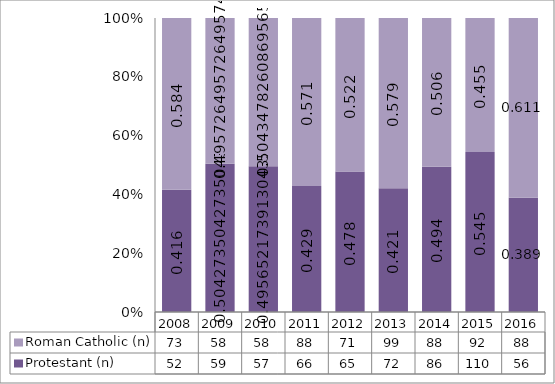
| Category | Protestant (n) | Roman Catholic (n) |
|---|---|---|
| 2008.0 | 52 | 73 |
| 2009.0 | 59 | 58 |
| 2010.0 | 57 | 58 |
| 2011.0 | 66 | 88 |
| 2012.0 | 65 | 71 |
| 2013.0 | 72 | 99 |
| 2014.0 | 86 | 88 |
| 2015.0 | 110 | 92 |
| 2016.0 | 56 | 88 |